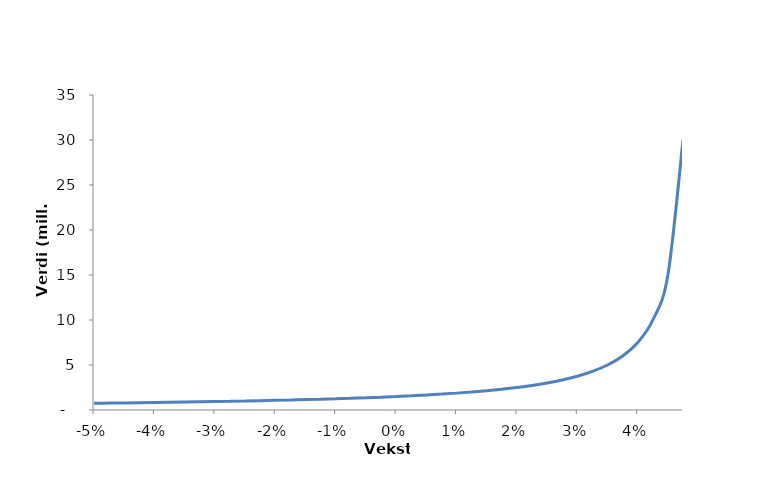
| Category | Series 0 |
|---|---|
| -0.05 | 0.75 |
| -0.0475 | 0.769 |
| -0.045 | 0.789 |
| -0.042499999999999996 | 0.811 |
| -0.039999999999999994 | 0.833 |
| -0.03749999999999999 | 0.857 |
| -0.03499999999999999 | 0.882 |
| -0.03249999999999999 | 0.909 |
| -0.02999999999999999 | 0.938 |
| -0.02749999999999999 | 0.968 |
| -0.02499999999999999 | 1 |
| -0.022499999999999992 | 1.034 |
| -0.019999999999999993 | 1.071 |
| -0.017499999999999995 | 1.111 |
| -0.014999999999999994 | 1.154 |
| -0.012499999999999994 | 1.2 |
| -0.009999999999999993 | 1.25 |
| -0.007499999999999993 | 1.304 |
| -0.004999999999999992 | 1.364 |
| -0.0024999999999999922 | 1.429 |
| 7.806255641895632e-18 | 1.5 |
| 0.002500000000000008 | 1.579 |
| 0.005000000000000008 | 1.667 |
| 0.007500000000000008 | 1.765 |
| 0.010000000000000009 | 1.875 |
| 0.01250000000000001 | 2 |
| 0.01500000000000001 | 2.143 |
| 0.01750000000000001 | 2.308 |
| 0.020000000000000007 | 2.5 |
| 0.022500000000000006 | 2.727 |
| 0.025000000000000005 | 3 |
| 0.027500000000000004 | 3.333 |
| 0.030000000000000002 | 3.75 |
| 0.0325 | 4.286 |
| 0.035 | 5 |
| 0.037500000000000006 | 6 |
| 0.04000000000000001 | 7.5 |
| 0.04250000000000001 | 10 |
| 0.04500000000000001 | 15 |
| 0.047500000000000014 | 30 |